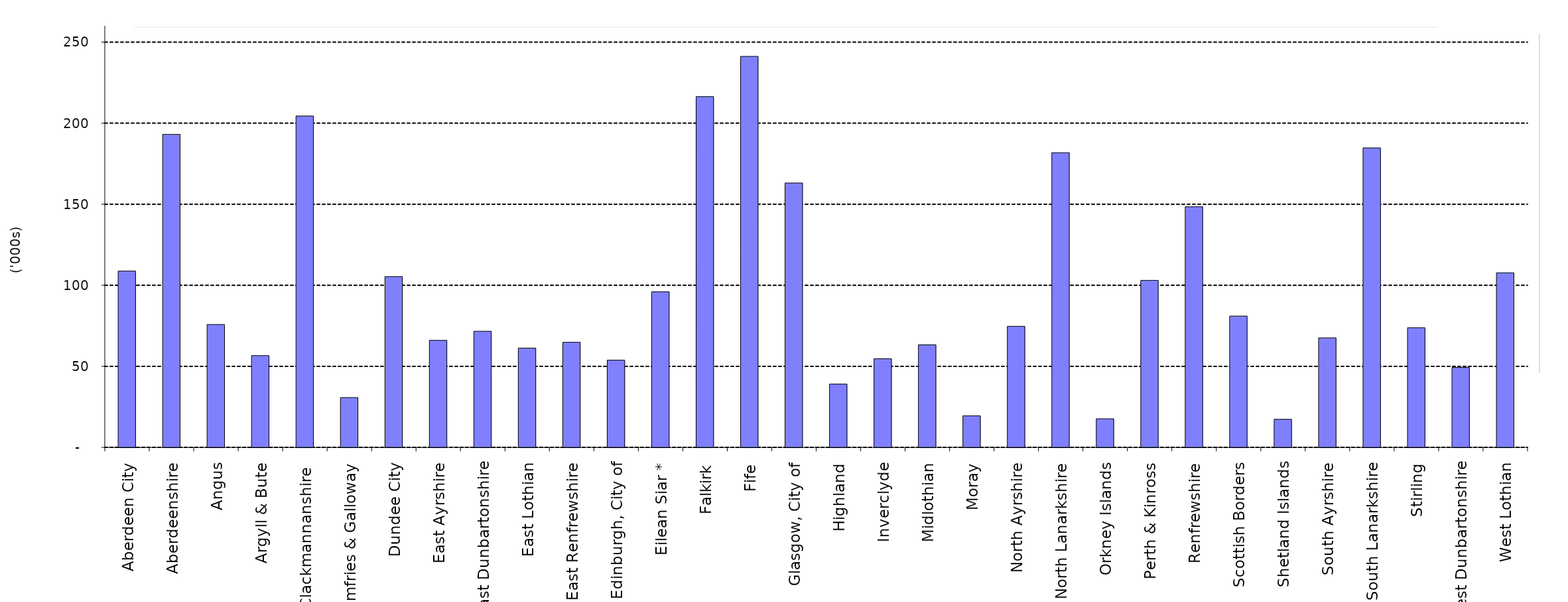
| Category | Series 0 |
|---|---|
| Aberdeen City | 108.793 |
| Aberdeenshire | 193.08 |
| Angus | 75.774 |
| Argyll & Bute | 56.594 |
| Clackmannanshire  | 204.391 |
| Dumfries & Galloway | 30.716 |
| Dundee City | 105.327 |
| East Ayrshire | 66.011 |
| East Dunbartonshire | 71.614 |
| East Lothian | 61.234 |
| East Renfrewshire | 64.826 |
| Edinburgh, City of | 53.793 |
| Eilean Siar * | 95.96 |
| Falkirk | 216.347 |
| Fife | 241.18 |
| Glasgow, City of | 163.063 |
| Highland | 39.036 |
| Inverclyde | 54.672 |
| Midlothian | 63.253 |
| Moray | 19.463 |
| North Ayrshire | 74.639 |
| North Lanarkshire | 181.778 |
| Orkney Islands | 17.625 |
| Perth & Kinross | 103.019 |
| Renfrewshire | 148.44 |
| Scottish Borders | 81.011 |
| Shetland Islands | 17.318 |
| South Ayrshire | 67.54 |
| South Lanarkshire | 184.713 |
| Stirling | 73.775 |
| West Dunbartonshire | 49.312 |
| West Lothian | 107.674 |